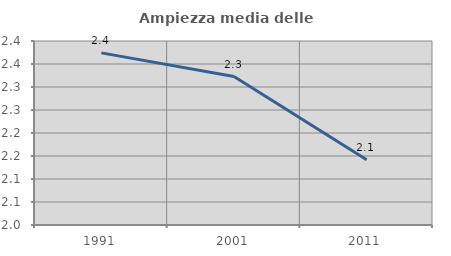
| Category | Ampiezza media delle famiglie |
|---|---|
| 1991.0 | 2.374 |
| 2001.0 | 2.323 |
| 2011.0 | 2.142 |